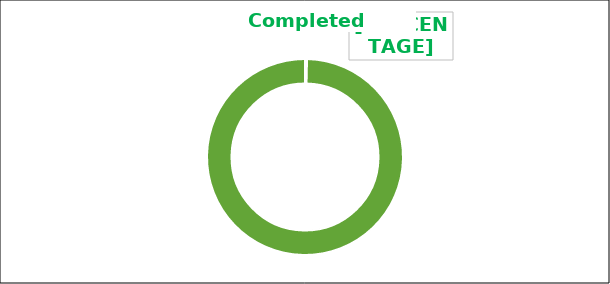
| Category | Series 0 |
|---|---|
| 0 | 1 |
| 1 | 299 |